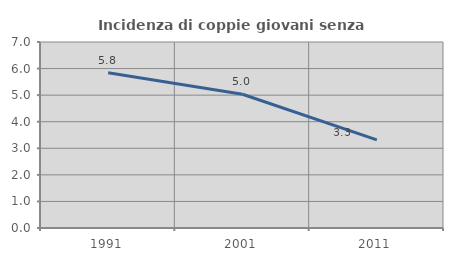
| Category | Incidenza di coppie giovani senza figli |
|---|---|
| 1991.0 | 5.84 |
| 2001.0 | 5.032 |
| 2011.0 | 3.317 |